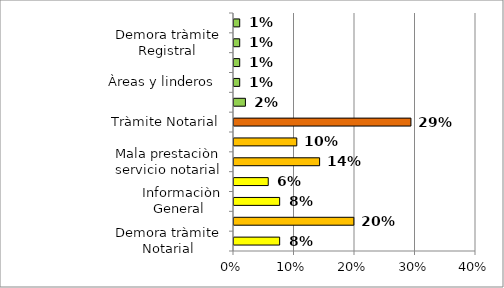
| Category | Series 0 |
|---|---|
| Demora tràmite Notarial | 0.075 |
| Estado Civil | 0.198 |
| Informaciòn General  | 0.075 |
| Estado Radicado | 0.057 |
| Mala prestaciòn servicio notarial | 0.142 |
| Otros  | 0.104 |
| Tràmite Notarial | 0.292 |
| Devoluciòn de dinero | 0.019 |
| Àreas y linderos  | 0.009 |
| Certificaciòn firma notario | 0.009 |
| Demora tràmite Registral | 0.009 |
| Mala prestaciòn del servicio Registral | 0.009 |